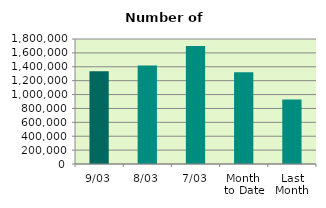
| Category | Series 0 |
|---|---|
| 9/03 | 1335256 |
| 8/03 | 1418218 |
| 7/03 | 1699968 |
| Month 
to Date | 1322952.286 |
| Last
Month | 928647.7 |